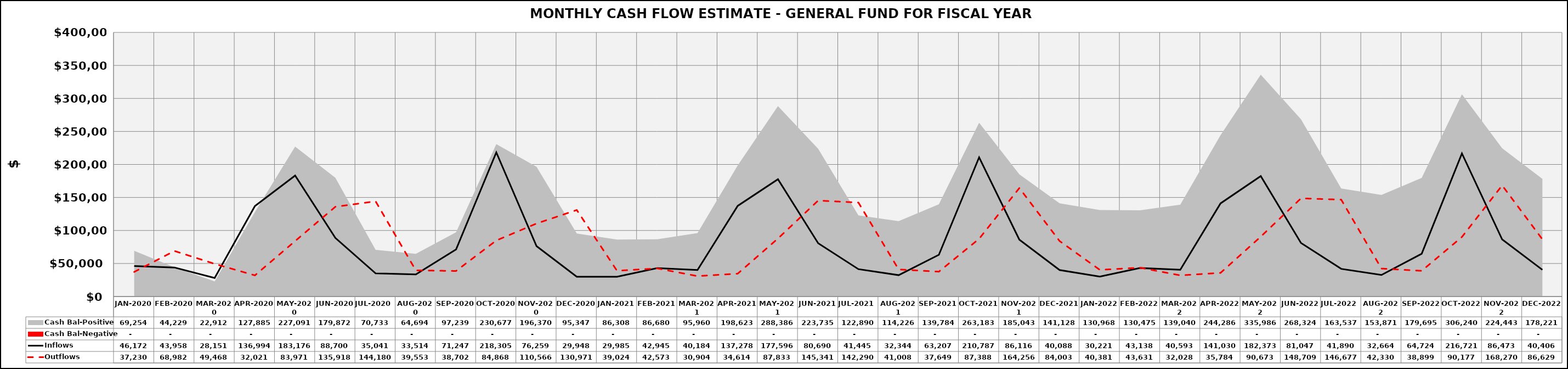
| Category | Inflows | Outflows |
|---|---|---|
| JAN-2020 | 46172.303 | 37230.443 |
| FEB-2020 | 43958.088 | 68982.454 |
| MAR-2020 | 28151.247 | 49468.388 |
| APR-2020 | 136993.617 | 32020.8 |
| MAY-2020 | 183176.218 | 83970.7 |
| JUN-2020 | 88699.588 | 135918.4 |
| JUL-2020 | 35041.089 | 144180 |
| AUG-2020 | 33514.455 | 39553.2 |
| SEP-2020 | 71247.058 | 38701.8 |
| OCT-2020 | 218305.362 | 84867.7 |
| NOV-2020 | 76258.753 | 110566.3 |
| DEC-2020 | 29948.079 | 130970.7 |
| JAN-2021 | 29985.359 | 39024.236 |
| FEB-2021 | 42945.382 | 42573.219 |
| MAR-2021 | 40183.521 | 30904.157 |
| APR-2021 | 137277.76 | 34614.452 |
| MAY-2021 | 177595.61 | 87832.715 |
| JUN-2021 | 80689.545 | 145340.649 |
| JUL-2021 | 41445.165 | 142290.135 |
| AUG-2021 | 32343.842 | 41007.737 |
| SEP-2021 | 63207.266 | 37649.426 |
| OCT-2021 | 210786.62 | 87387.656 |
| NOV-2021 | 86115.78 | 164255.825 |
| DEC-2021 | 40088.219 | 84003.287 |
| JAN-2022 | 30221.363 | 40380.902 |
| FEB-2022 | 43138.143 | 43631.216 |
| MAR-2022 | 40593.332 | 32028.127 |
| APR-2022 | 141029.861 | 35783.834 |
| MAY-2022 | 182372.732 | 90672.928 |
| JUN-2022 | 81047.294 | 148709.335 |
| JUL-2022 | 41890.221 | 146677.099 |
| AUG-2022 | 32663.681 | 42330.159 |
| SEP-2022 | 64723.843 | 38899.227 |
| OCT-2022 | 216721.465 | 90176.719 |
| NOV-2022 | 86472.84 | 168269.773 |
| DEC-2022 | 40406.275 | 86628.52 |